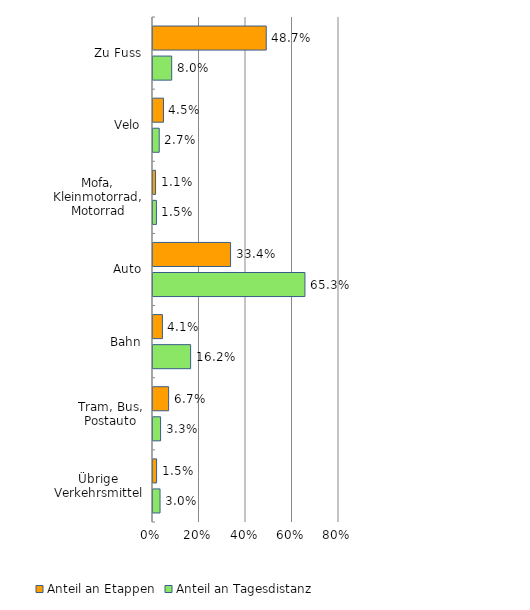
| Category | Anteil an Etappen | Anteil an Tagesdistanz |
|---|---|---|
| Zu Fuss | 48.708 | 8.038 |
| Velo | 4.516 | 2.681 |
| Mofa, Kleinmotorrad, Motorrad | 1.101 | 1.475 |
| Auto | 33.357 | 65.346 |
| Bahn | 4.059 | 16.179 |
| Tram, Bus, Postauto | 6.718 | 3.253 |
| Übrige Verkehrsmittel | 1.54 | 3.029 |